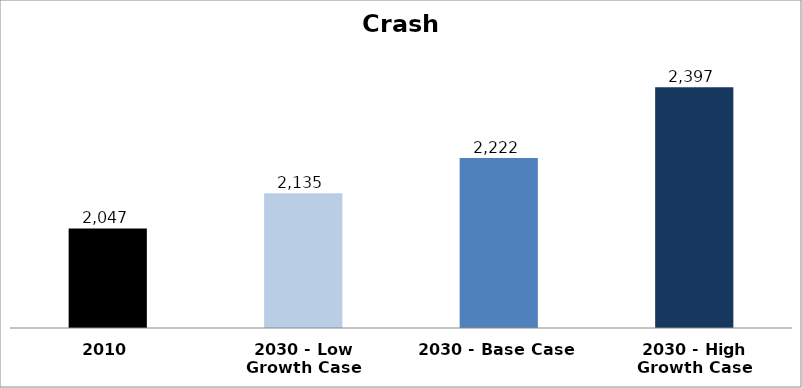
| Category | Crash Rate |
|---|---|
| 2010 | 2047.165 |
| 2030 - Low Growth Case | 2134.712 |
| 2030 - Base Case | 2222.26 |
| 2030 - High Growth Case | 2397.354 |